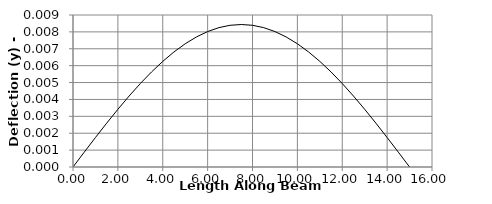
| Category | y |
|---|---|
| 0.0 | 0 |
| 1e-05 | 0 |
| 0.5 | 0.001 |
| 1.0 | 0.002 |
| 1.5 | 0.003 |
| 2.0 | 0.003 |
| 2.00001 | 0.003 |
| 2.5 | 0.004 |
| 3.0 | 0.005 |
| 3.5 | 0.006 |
| 4.0 | 0.006 |
| 4.5 | 0.007 |
| 5.0 | 0.007 |
| 5.5 | 0.008 |
| 6.0 | 0.008 |
| 6.5 | 0.008 |
| 7.0 | 0.008 |
| 7.5 | 0.008 |
| 8.0 | 0.008 |
| 8.5 | 0.008 |
| 9.0 | 0.008 |
| 9.5 | 0.008 |
| 10.0 | 0.007 |
| 10.5 | 0.007 |
| 11.0 | 0.006 |
| 11.5 | 0.006 |
| 12.0 | 0.005 |
| 12.5 | 0.004 |
| 13.0 | 0.003 |
| 13.5 | 0.003 |
| 14.0 | 0.002 |
| 14.5 | 0.001 |
| 15.0 | 0 |